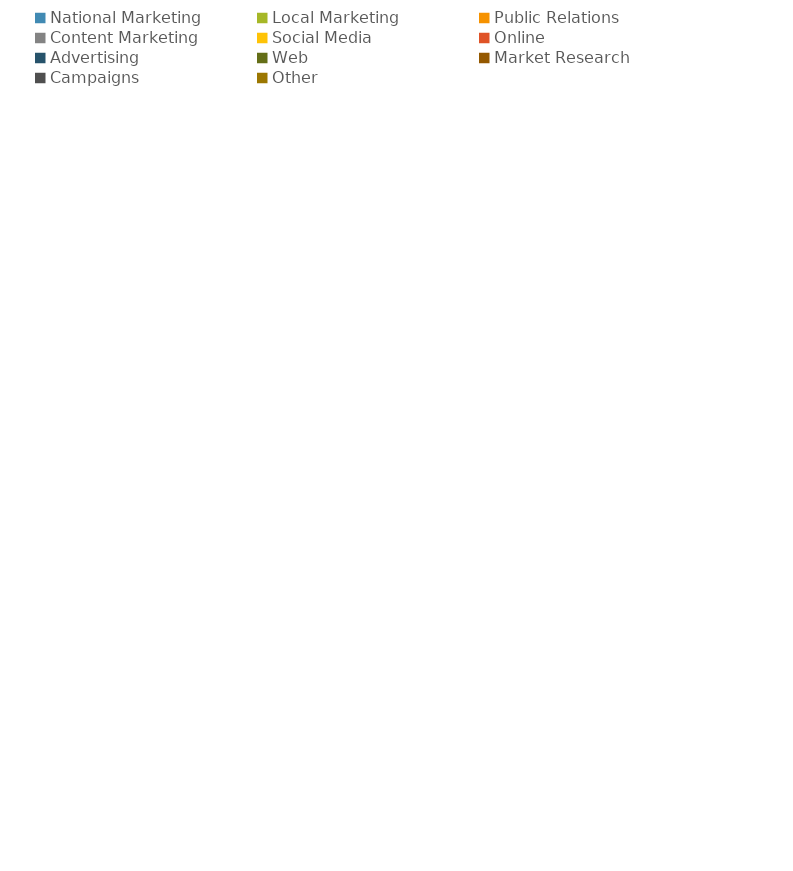
| Category | Series 0 | Series 1 |
|---|---|---|
| National Marketing | 0 | 0 |
| Local Marketing | 0 | 0 |
| Public Relations | 0 | 0 |
| Content Marketing | 0 | 0 |
| Social Media | 0 | 0 |
| Online | 0 | 0 |
| Advertising | 0 | 0 |
| Web | 0 | 0 |
| Market Research | 0 | 0 |
| Campaigns | 0 | 0 |
| Other | 0 | 0 |